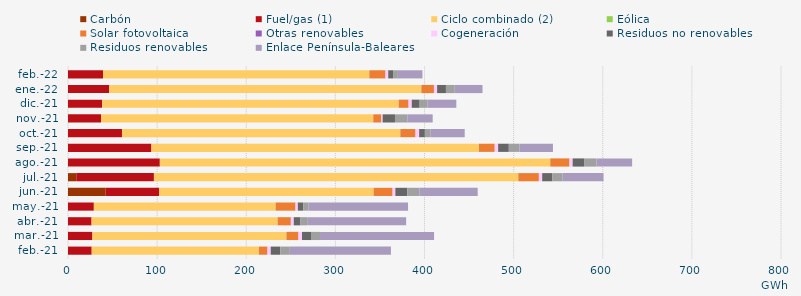
| Category | Carbón | Fuel/gas (1) | Ciclo combinado (2) | Eólica | Solar fotovoltaica | Otras renovables | Cogeneración | Residuos no renovables | Residuos renovables | Enlace Península-Baleares |
|---|---|---|---|---|---|---|---|---|---|---|
| feb.-21 | -0.606 | 26.606 | 187.465 | 0.159 | 9.513 | 0.077 | 3.642 | 10.724 | 10.724 | 113.412 |
| mar.-21 | -0.652 | 27.37 | 217.479 | 0.306 | 13.293 | 0.138 | 3.995 | 10.093 | 10.093 | 127.986 |
| abr.-21 | -0.591 | 26.435 | 208.531 | 0.295 | 14.71 | 0.106 | 3.221 | 7.539 | 7.539 | 111.022 |
| may.-21 | -1.103 | 28.997 | 203.813 | 0.19 | 22.208 | 0.119 | 2.572 | 6.024 | 6.024 | 111.602 |
| jun.-21 | 41.953 | 60.343 | 240.578 | 0.094 | 21.167 | 0.099 | 3.062 | 13.482 | 13.482 | 65.429 |
| jul.-21 | 9.293 | 87.1 | 408.794 | 0.106 | 22.964 | 0.096 | 3.691 | 11.473 | 11.473 | 45.879 |
| ago.-21 | -0.729 | 103.041 | 437.914 | 0.201 | 21.416 | 0.084 | 3.568 | 13.32 | 13.32 | 40.107 |
| sep.-21 | -0.55 | 93.586 | 367.241 | 0.274 | 17.622 | 0.081 | 3.819 | 11.973 | 11.973 | 37.549 |
| oct.-21 | -0.583 | 60.568 | 312.103 | 0.27 | 16.793 | 0.243 | 4.021 | 6.415 | 6.415 | 38.286 |
| nov.-21 | -0.582 | 37.046 | 305.438 | 0.061 | 8.803 | 0.24 | 1.412 | 13.868 | 13.868 | 28.436 |
| dic.-21 | -0.614 | 38.331 | 332.591 | 0.101 | 10.929 | 0.23 | 3.519 | 8.866 | 8.866 | 32.271 |
| ene.-22 | -0.627 | 46.217 | 350.083 | 0.216 | 13.972 | 0.285 | 3.401 | 9.871 | 9.871 | 31.159 |
| feb.-22 | -0.58 | 39.3 | 298.618 | 0.228 | 17.801 | 0.281 | 3.068 | 5.441 | 5.441 | 27.503 |